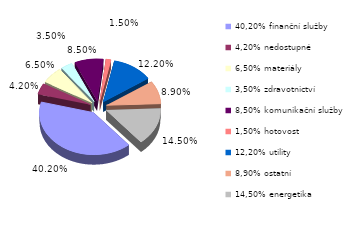
| Category | Series 0 |
|---|---|
| 40,20% finanční služby | 0.402 |
| 4,20% nedostupné | 0.042 |
| 6,50% materiály | 0.065 |
| 3,50% zdravotnictví | 0.035 |
| 8,50% komunikační služby | 0.085 |
| 1,50% hotovost | 0.015 |
| 12,20% utility | 0.122 |
| 8,90% ostatní | 0.089 |
| 14,50% energetika | 0.145 |